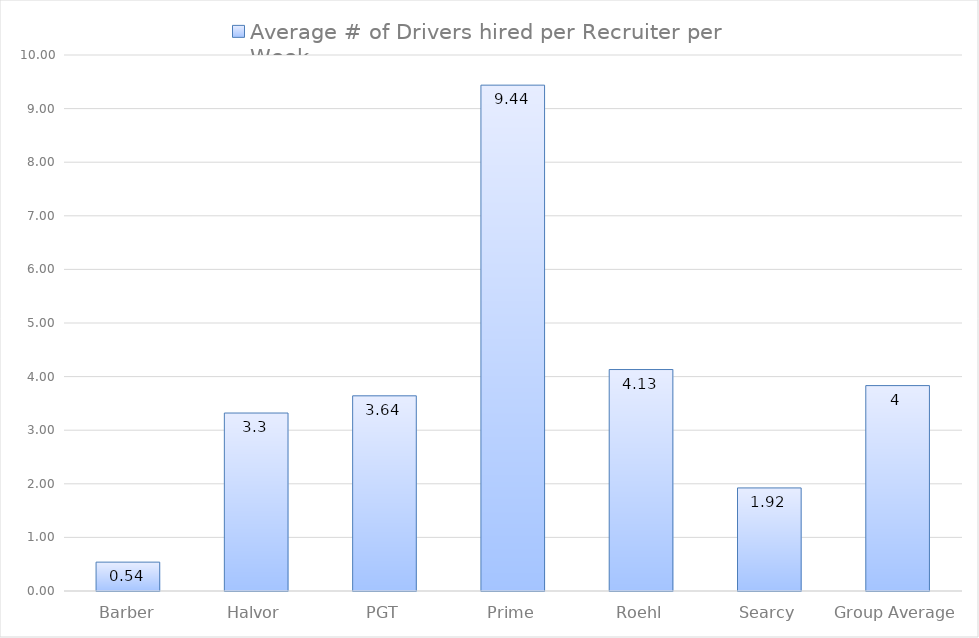
| Category | Average # of Drivers hired per Recruiter per Week |
|---|---|
| Barber | 0.538 |
| Halvor | 3.321 |
| PGT | 3.641 |
| Prime | 9.438 |
| Roehl | 4.132 |
| Searcy | 1.923 |
| Group Average | 3.832 |